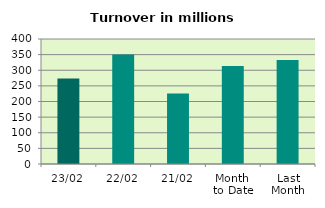
| Category | Series 0 |
|---|---|
| 23/02 | 273.499 |
| 22/02 | 350.292 |
| 21/02 | 225.751 |
| Month 
to Date | 313.958 |
| Last
Month | 332.646 |